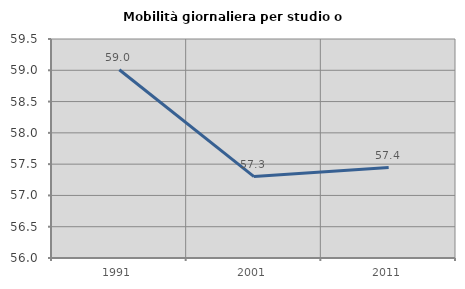
| Category | Mobilità giornaliera per studio o lavoro |
|---|---|
| 1991.0 | 59.009 |
| 2001.0 | 57.301 |
| 2011.0 | 57.446 |